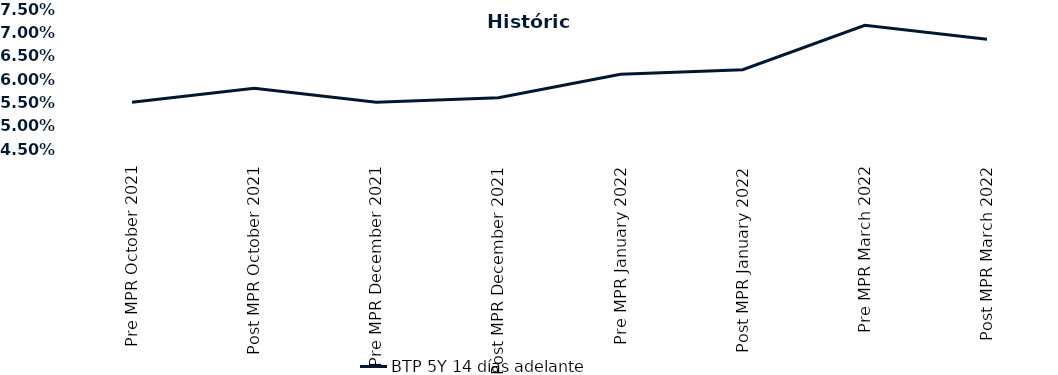
| Category | BTP 5Y 14 días adelante |
|---|---|
| Pre MPR October 2021 | 0.055 |
| Post MPR October 2021 | 0.058 |
| Pre MPR December 2021 | 0.055 |
| Post MPR December 2021 | 0.056 |
| Pre MPR January 2022 | 0.061 |
| Post MPR January 2022 | 0.062 |
| Pre MPR March 2022 | 0.072 |
| Post MPR March 2022 | 0.068 |